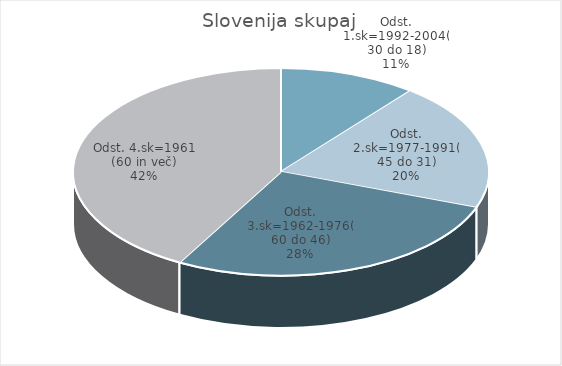
| Category | Slovenija skupaj |
|---|---|
| Odst. 1.sk=1992-2004(30 do 18) | 5.48 |
| Odst. 2.sk=1977-1991(45 do 31) | 10.18 |
| Odst. 3.sk=1962-1976(60 do 46) | 14.08 |
| Odst. 4.sk=1961 (60 in več) | 21.44 |